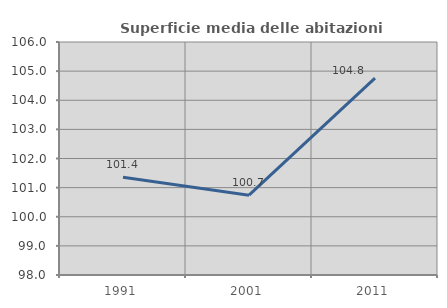
| Category | Superficie media delle abitazioni occupate |
|---|---|
| 1991.0 | 101.354 |
| 2001.0 | 100.741 |
| 2011.0 | 104.762 |